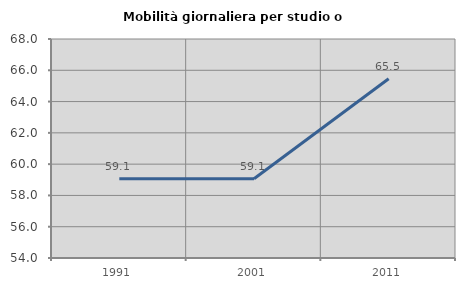
| Category | Mobilità giornaliera per studio o lavoro |
|---|---|
| 1991.0 | 59.066 |
| 2001.0 | 59.062 |
| 2011.0 | 65.458 |